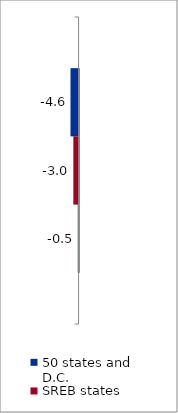
| Category | 50 states and D.C. | SREB states | State |
|---|---|---|---|
| 2012 to 2017 | -4.556 | -2.952 | -0.459 |